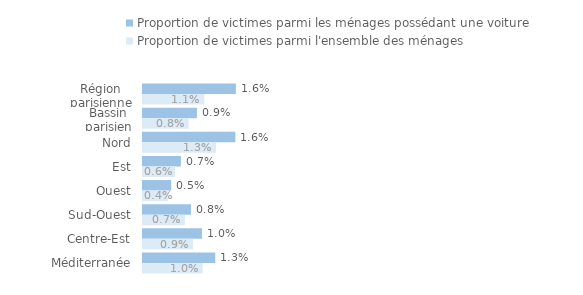
| Category | Proportion de victimes parmi les ménages possédant une voiture | Proportion de victimes parmi l'ensemble des ménages |
|---|---|---|
| Région parisienne | 0.016 | 0.011 |
| Bassin parisien | 0.009 | 0.008 |
| Nord | 0.016 | 0.013 |
| Est | 0.007 | 0.006 |
| Ouest | 0.005 | 0.004 |
| Sud-Ouest | 0.008 | 0.007 |
| Centre-Est | 0.01 | 0.009 |
| Méditerranée | 0.013 | 0.01 |